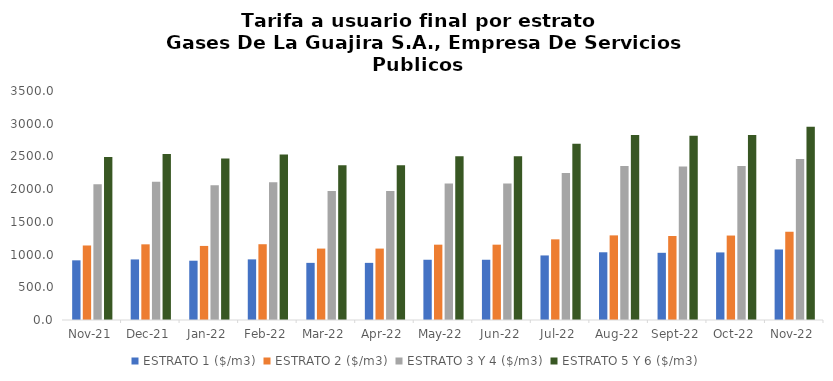
| Category | ESTRATO 1 ($/m3) | ESTRATO 2 ($/m3) | ESTRATO 3 Y 4 ($/m3) | ESTRATO 5 Y 6 ($/m3) |
|---|---|---|---|---|
| 2021-11-01 | 911.95 | 1138.82 | 2075.09 | 2490.108 |
| 2021-12-01 | 925.76 | 1156.56 | 2113.12 | 2535.744 |
| 2022-01-01 | 906.06 | 1131.99 | 2058.47 | 2470.164 |
| 2022-02-01 | 926.6 | 1158.16 | 2107.04 | 2528.448 |
| 2022-03-01 | 873.25 | 1091.56 | 1971.08 | 2365.296 |
| 2022-04-01 | 873.25 | 1091.56 | 1971.08 | 2365.296 |
| 2022-05-01 | 920.85 | 1151.33 | 2084.51 | 2501.412 |
| 2022-06-01 | 920.85 | 1151.33 | 2084.51 | 2501.412 |
| 2022-07-01 | 986.73 | 1232.87 | 2244.9 | 2693.88 |
| 2022-08-01 | 1035.13 | 1293.39 | 2355.1 | 2826.12 |
| 2022-09-01 | 1026.99 | 1283.72 | 2345.53 | 2814.6 |
| 2022-10-01 | 1032.88 | 1290.83 | 2355.1 | 2826.12 |
| 2022-11-01 | 1077.8 | 1346.96 | 2461.97 | 2954.364 |